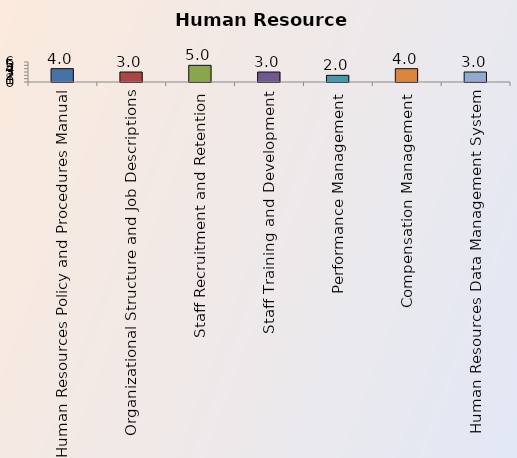
| Category | Series 0 |
|---|---|
| Human Resources Policy and Procedures Manual | 4 |
| Organizational Structure and Job Descriptions | 3 |
| Staff Recruitment and Retention | 5 |
| Staff Training and Development | 3 |
| Performance Management | 2 |
| Compensation Management | 4 |
| Human Resources Data Management System | 3 |